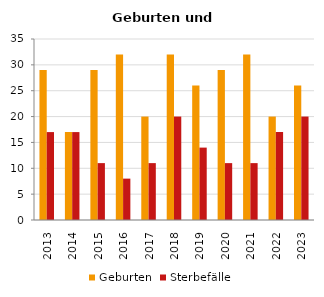
| Category | Geburten | Sterbefälle |
|---|---|---|
| 2013.0 | 29 | 17 |
| 2014.0 | 17 | 17 |
| 2015.0 | 29 | 11 |
| 2016.0 | 32 | 8 |
| 2017.0 | 20 | 11 |
| 2018.0 | 32 | 20 |
| 2019.0 | 26 | 14 |
| 2020.0 | 29 | 11 |
| 2021.0 | 32 | 11 |
| 2022.0 | 20 | 17 |
| 2023.0 | 26 | 20 |